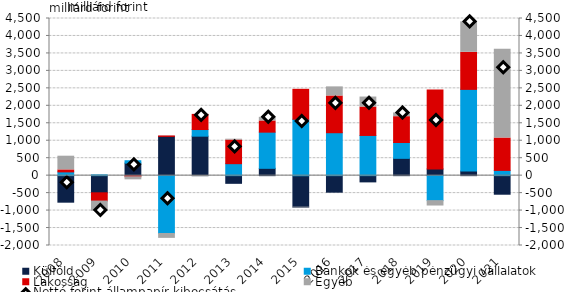
| Category | Külföld | Bankok és egyéb pénzügyi vállalatok | Lakosság | Egyéb |
|---|---|---|---|---|
| 2008.0 | -759.65 | 107.753 | 57.047 | 392.2 |
| 2009.0 | -491.4 | 23.556 | -236.156 | -293.241 |
| 2010.0 | 358.869 | 68.381 | -32.221 | -87.487 |
| 2011.0 | 1124.084 | -1656.51 | 11.985 | -139.476 |
| 2012.0 | 1130.805 | 189.835 | 433.858 | -29.175 |
| 2013.0 | -219.704 | 342.911 | 675.773 | 24.837 |
| 2014.0 | 209.723 | 1035.767 | 320.976 | 103.968 |
| 2015.0 | -901.505 | 1614.165 | 857.987 | -21.991 |
| 2016.0 | -472.926 | 1229.477 | 1051.766 | 261.126 |
| 2017.0 | -178.442 | 1151.054 | 813.833 | 286.152 |
| 2018.0 | 495.598 | 454.326 | 738.809 | 106.89 |
| 2019.0 | 191.648 | -715.225 | 2258.289 | -154.593 |
| 2020.0 | 130.571 | 2340.032 | 1061.422 | 872.127 |
| 2021.0 | -531.78 | 150.168 | 927.345 | 2545.472 |